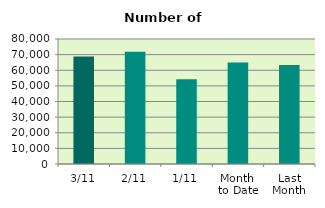
| Category | Series 0 |
|---|---|
| 3/11 | 68792 |
| 2/11 | 71912 |
| 1/11 | 54268 |
| Month 
to Date | 64990.667 |
| Last
Month | 63348.667 |